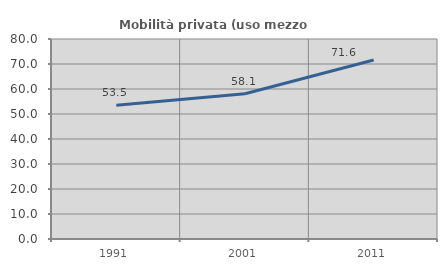
| Category | Mobilità privata (uso mezzo privato) |
|---|---|
| 1991.0 | 53.485 |
| 2001.0 | 58.099 |
| 2011.0 | 71.616 |